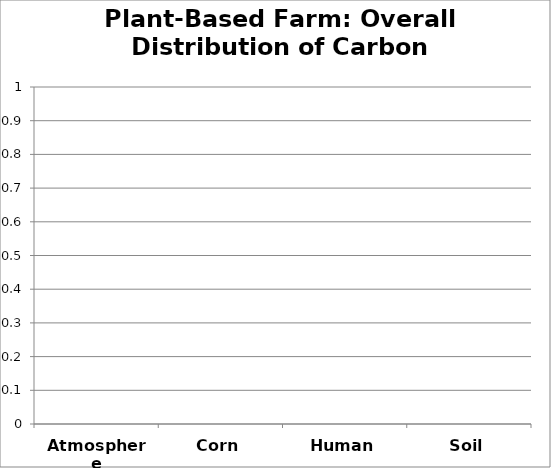
| Category | Series 0 |
|---|---|
| Atmosphere | 0 |
| Corn | 0 |
| Human | 0 |
| Soil | 0 |